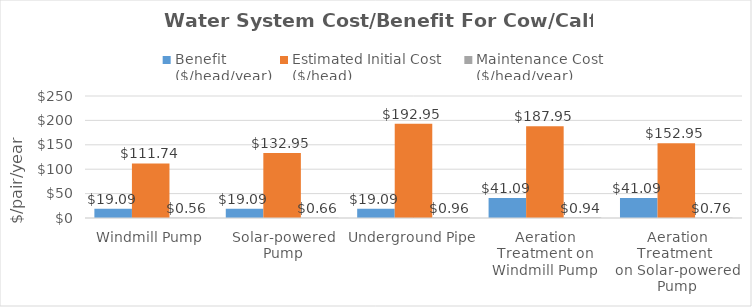
| Category | Benefit 
($/head/year) | Estimated Initial Cost 
($/head) | Maintenance Cost
($/head/year) |
|---|---|---|---|
| Windmill Pump | 19.092 | 111.74 | 0.559 |
| Solar-powered Pump | 19.092 | 132.95 | 0.665 |
| Underground Pipe | 19.092 | 192.95 | 0.965 |
| Aeration Treatment on Windmill Pump | 41.089 | 187.95 | 0.94 |
| Aeration Treatment 
on Solar-powered Pump | 41.089 | 152.95 | 0.765 |